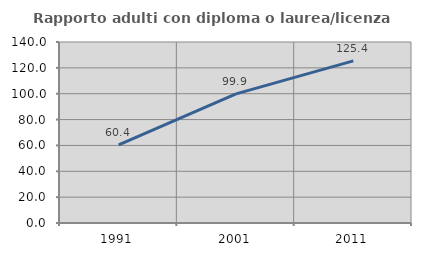
| Category | Rapporto adulti con diploma o laurea/licenza media  |
|---|---|
| 1991.0 | 60.386 |
| 2001.0 | 99.854 |
| 2011.0 | 125.359 |